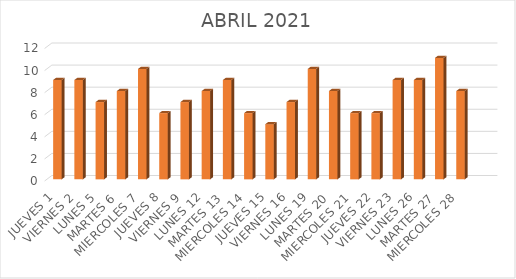
| Category | DIAS | PERSONAS ATENDIDAS | Series 1 |
|---|---|---|---|
| JUEVES 1 |  |  | 9 |
| VIERNES 2 |  |  | 9 |
| LUNES 5 |  |  | 7 |
| MARTES 6 |  |  | 8 |
| MIERCOLES 7 |  |  | 10 |
| JUEVES 8 |  |  | 6 |
| VIERNES 9 |  |  | 7 |
| LUNES 12 |  |  | 8 |
| MARTES 13 |  |  | 9 |
| MIERCOLES 14 |  |  | 6 |
| JUEVES 15 |  |  | 5 |
| VIERNES 16 |  |  | 7 |
| LUNES 19 |  |  | 10 |
| MARTES 20 |  |  | 8 |
| MIERCOLES 21 |  |  | 6 |
| JUEVES 22 |  |  | 6 |
| VIERNES 23 |  |  | 9 |
| LUNES 26 |  |  | 9 |
| MARTES 27 |  |  | 11 |
| MIERCOLES 28 |  |  | 8 |